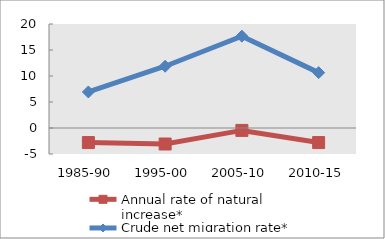
| Category | Annual rate of natural increase* | Crude net migration rate* |
|---|---|---|
| 1985-90 | -2.8 | 6.933 |
| 1995-00 | -3.078 | 11.876 |
| 2005-10 | -0.464 | 17.658 |
| 2010-15 | -2.799 | 10.649 |